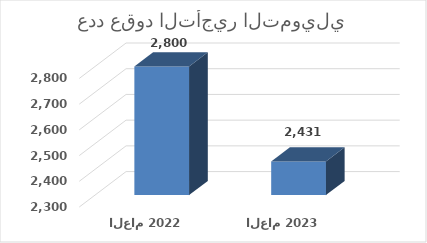
| Category | Series 0 |
|---|---|
| العام 2022 | 2800 |
| العام 2023 | 2431 |